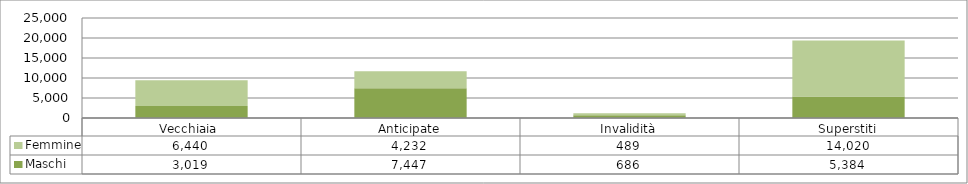
| Category | Maschi | Femmine |
|---|---|---|
| Vecchiaia  | 3019 | 6440 |
| Anticipate | 7447 | 4232 |
| Invalidità | 686 | 489 |
| Superstiti | 5384 | 14020 |